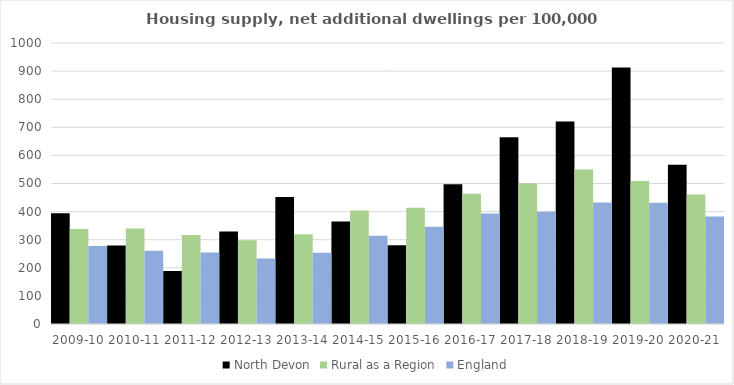
| Category | North Devon | Rural as a Region | England |
|---|---|---|---|
| 2009-10 | 393.891 | 337.852 | 277.548 |
| 2010-11 | 279.228 | 340.105 | 260.994 |
| 2011-12 | 188.346 | 317.04 | 254.007 |
| 2012-13 | 329.266 | 297.763 | 233.153 |
| 2013-14 | 451.838 | 319.835 | 253.602 |
| 2014-15 | 364.789 | 403.796 | 314.256 |
| 2015-16 | 280.368 | 414.091 | 346.154 |
| 2016-17 | 497.66 | 463.209 | 393.256 |
| 2017-18 | 664.292 | 500.68 | 399.646 |
| 2018-19 | 721.049 | 549.491 | 432.099 |
| 2019-20 | 913.068 | 508.493 | 431.187 |
| 2020-21 | 566.364 | 461.114 | 382.827 |